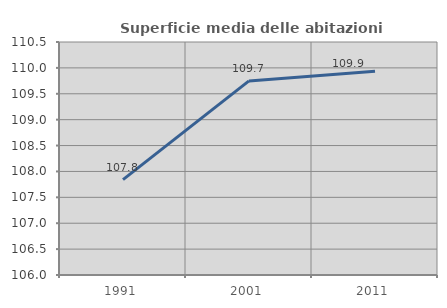
| Category | Superficie media delle abitazioni occupate |
|---|---|
| 1991.0 | 107.841 |
| 2001.0 | 109.749 |
| 2011.0 | 109.937 |